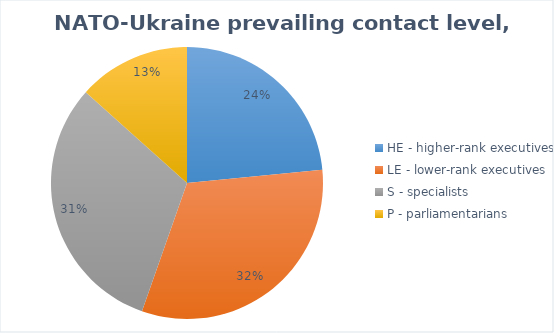
| Category | 1997-2015 |
|---|---|
| HE - higher-rank executives | 72 |
| LE - lower-rank executives | 98 |
| S - specialists | 96 |
| P - parliamentarians | 41 |